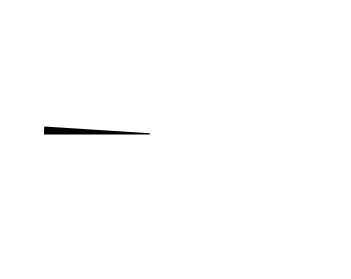
| Category | Series 0 |
|---|---|
| 0 | 0 |
| 1 | 0 |
| 2 | 2 |
| 3 | 0 |
| 4 | 98 |
| 5 | 0 |
| 6 | 0 |
| 7 | 0 |
| 8 | 0 |
| 9 | 0 |
| 10 | 100 |